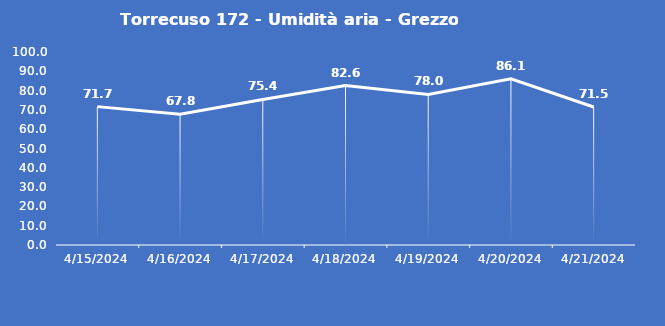
| Category | Torrecuso 172 - Umidità aria - Grezzo (%) |
|---|---|
| 4/15/24 | 71.7 |
| 4/16/24 | 67.8 |
| 4/17/24 | 75.4 |
| 4/18/24 | 82.6 |
| 4/19/24 | 78 |
| 4/20/24 | 86.1 |
| 4/21/24 | 71.5 |